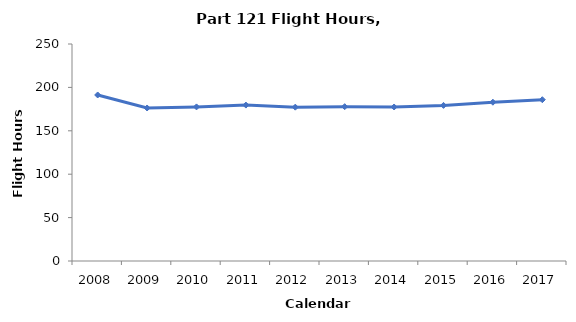
| Category | Flight Hours (100,000s) |
|---|---|
| 2008.0 | 191.268 |
| 2009.0 | 176.268 |
| 2010.0 | 177.51 |
| 2011.0 | 179.63 |
| 2012.0 | 177.222 |
| 2013.0 | 177.796 |
| 2014.0 | 177.428 |
| 2015.0 | 179.258 |
| 2016.0 | 182.941 |
| 2017.0 | 185.814 |